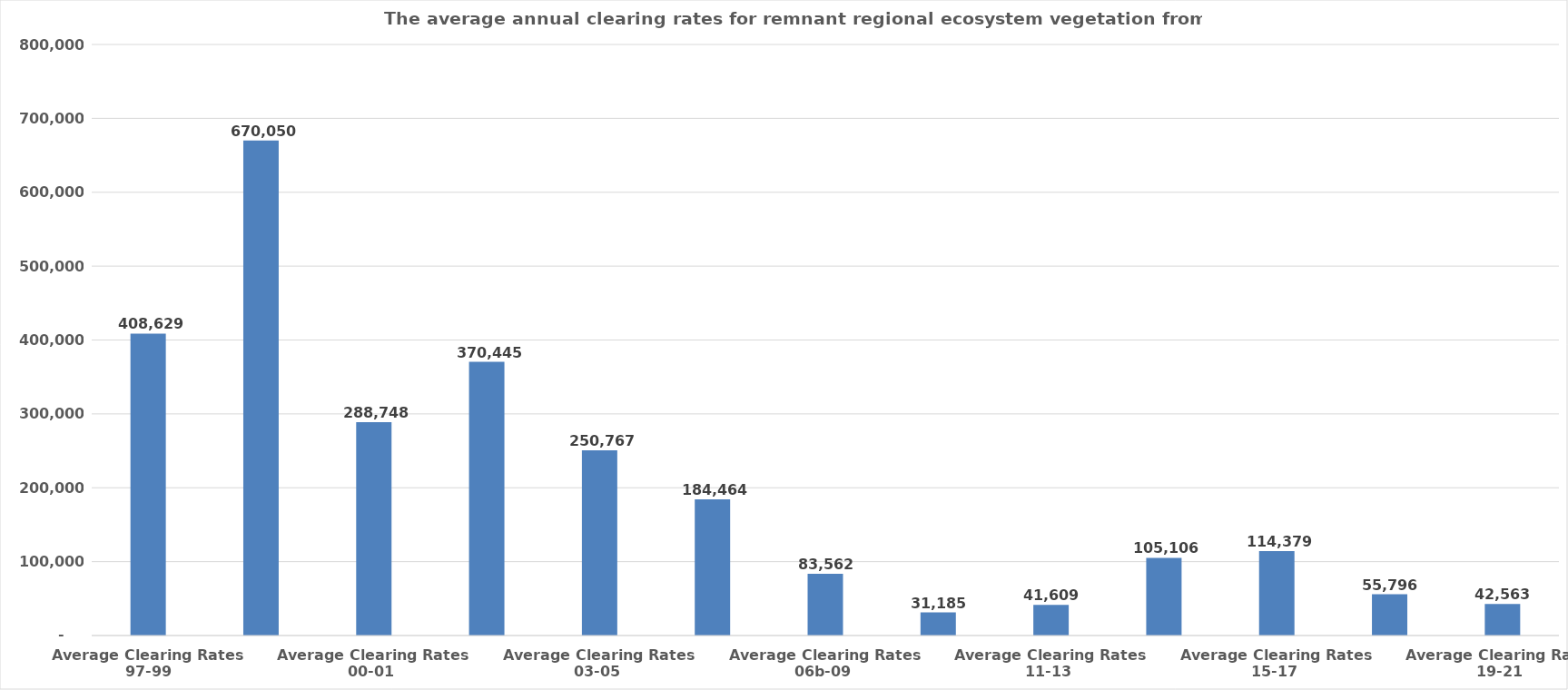
| Category | Series 0 |
|---|---|
| Average Clearing Rates 97-99 | 408628.681 |
| Average Clearing Rates 99-00  | 670050.455 |
| Average Clearing Rates 00-01  | 288748.13 |
| Average Clearing Rates 01-03  | 370444.516 |
| Average Clearing Rates 03-05  | 250766.9 |
| Average Clearing Rates 05-06b  | 184464.131 |
| Average Clearing Rates 06b-09  | 83562.175 |
| Average Clearing Rates 09-11  | 31184.645 |
| Average Clearing Rates 11-13  | 41609.202 |
| Average Clearing Rates 13-15  | 105105.573 |
| Average Clearing Rates 15-17  | 114379.306 |
| Average Clearing Rates 17-19  | 55796.289 |
| Average Clearing Rates 19-21  | 42563.492 |